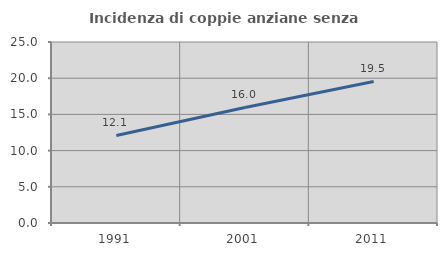
| Category | Incidenza di coppie anziane senza figli  |
|---|---|
| 1991.0 | 12.098 |
| 2001.0 | 15.959 |
| 2011.0 | 19.547 |